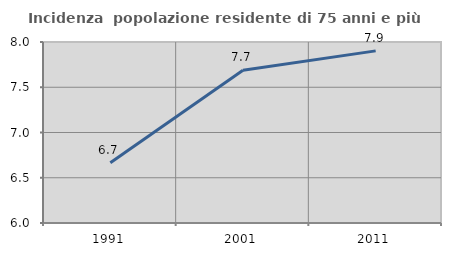
| Category | Incidenza  popolazione residente di 75 anni e più |
|---|---|
| 1991.0 | 6.667 |
| 2001.0 | 7.687 |
| 2011.0 | 7.902 |